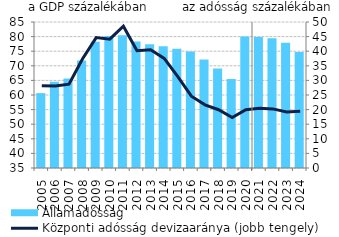
| Category | Államadósság |
|---|---|
| 2005.0 | 60.642 |
| 2006.0 | 64.504 |
| 2007.0 | 65.654 |
| 2008.0 | 71.843 |
| 2009.0 | 78.217 |
| 2010.0 | 80.163 |
| 2011.0 | 80.442 |
| 2012.0 | 78.361 |
| 2013.0 | 77.354 |
| 2014.0 | 76.688 |
| 2015.0 | 75.821 |
| 2016.0 | 74.932 |
| 2017.0 | 72.163 |
| 2018.0 | 69.117 |
| 2019.0 | 65.488 |
| 2020.0 | 80.056 |
| 2021.0 | 79.842 |
| 2022.0 | 79.445 |
| 2023.0 | 77.856 |
| 2024.0 | 74.72 |